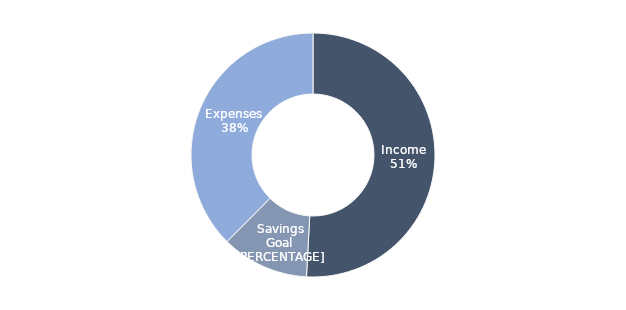
| Category | Series 0 |
|---|---|
| Income | 7257 |
| Savings Goal | 1655 |
| Expenses | 5359 |